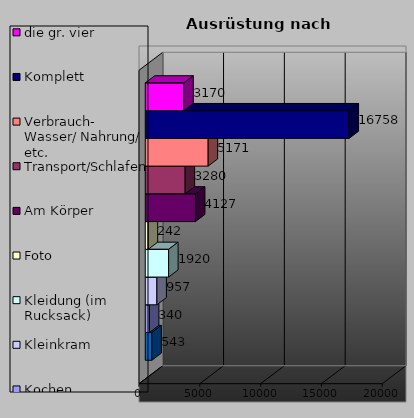
| Category | Orientierung | Kochen | Kleinkram | Kleidung (im Rucksack) | Foto | Am Körper | Transport/Schlafen | Verbrauch- Wasser/ Nahrung/ etc. | Komplett | die gr. vier |
|---|---|---|---|---|---|---|---|---|---|---|
| 0 | 543 | 340 | 957 | 1920 | 242 | 4127 | 3280 | 5171 | 16758 | 3170 |